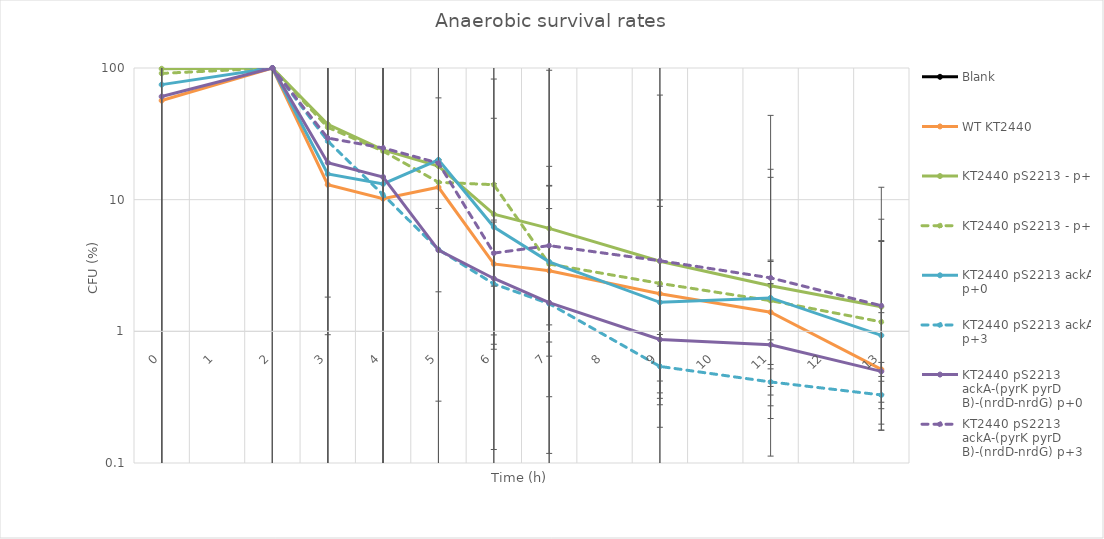
| Category | Blank | WT KT2440 | KT2440 pS2213 - p+0 | KT2440 pS2213 - p+3 | KT2440 pS2213 ackA p+0 | KT2440 pS2213 ackA p+3 | KT2440 pS2213 ackA-(pyrK pyrD B)-(nrdD-nrdG) p+0 | KT2440 pS2213 ackA-(pyrK pyrD B)-(nrdD-nrdG) p+3 |
|---|---|---|---|---|---|---|---|---|
| 0.0 | 0 | 56.602 | 98.651 | 91.002 | 74.771 | 109.989 | 60.712 | 116.784 |
| 2.0 | 0 | 100 | 100 | 100 | 100 | 100 | 100 | 100 |
| 3.0 | 0 | 12.99 | 37.341 | 35.429 | 15.688 | 27.871 | 19.093 | 29.365 |
| 4.0 | 0 | 10.165 | 23.892 | 23.374 | 13.165 | 10.895 | 14.864 | 24.711 |
| 5.0 | 0 | 12.422 | 17.977 | 13.558 | 20.069 | 4.181 | 4.137 | 18.956 |
| 6.0 | 0 | 3.25 | 7.763 | 12.991 | 6.202 | 2.293 | 2.52 | 3.927 |
| 7.0 | 0 | 2.883 | 6.054 | 3.245 | 3.372 | 1.622 | 1.652 | 4.477 |
| 9.0 | 0 | 1.931 | 3.41 | 2.313 | 1.661 | 0.541 | 0.867 | 3.437 |
| 11.0 | 0 | 1.395 | 2.22 | 1.71 | 1.794 | 0.413 | 0.791 | 2.547 |
| 13.0 | 0 | 0.514 | 1.538 | 1.18 | 0.931 | 0.329 | 0.496 | 1.566 |